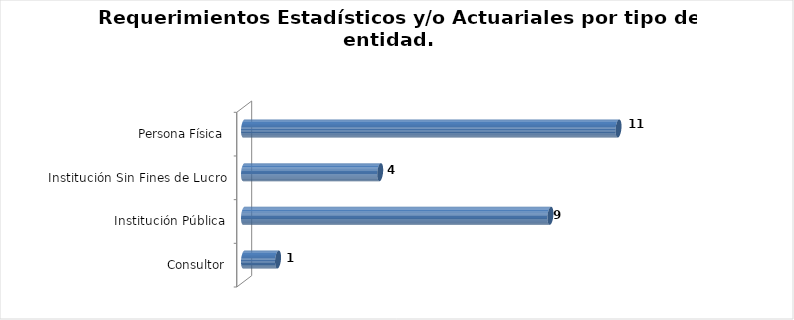
| Category | Total |
|---|---|
| Consultor | 1 |
| Institución Pública | 9 |
| Institución Sin Fines de Lucro | 4 |
| Persona Física | 11 |